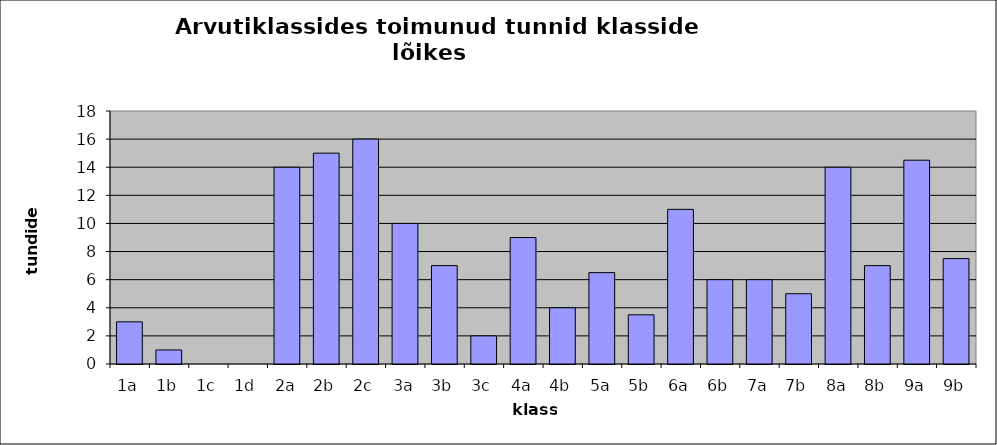
| Category | Series 0 |
|---|---|
| 1a | 3 |
| 1b | 1 |
| 1c | 0 |
| 1d | 0 |
| 2a | 14 |
| 2b | 15 |
| 2c | 16 |
| 3a | 10 |
| 3b | 7 |
| 3c | 2 |
| 4a | 9 |
| 4b | 4 |
| 5a | 6.5 |
| 5b | 3.5 |
| 6a | 11 |
| 6b | 6 |
| 7a | 6 |
| 7b | 5 |
| 8a | 14 |
| 8b | 7 |
| 9a | 14.5 |
| 9b | 7.5 |